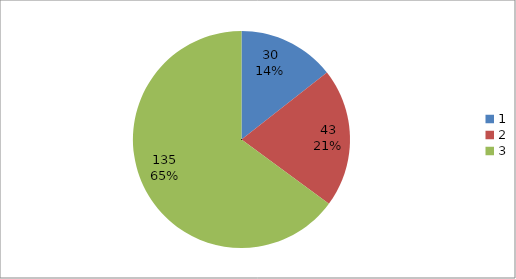
| Category | Series 0 |
|---|---|
| 0 | 30 |
| 1 | 43 |
| 2 | 135 |